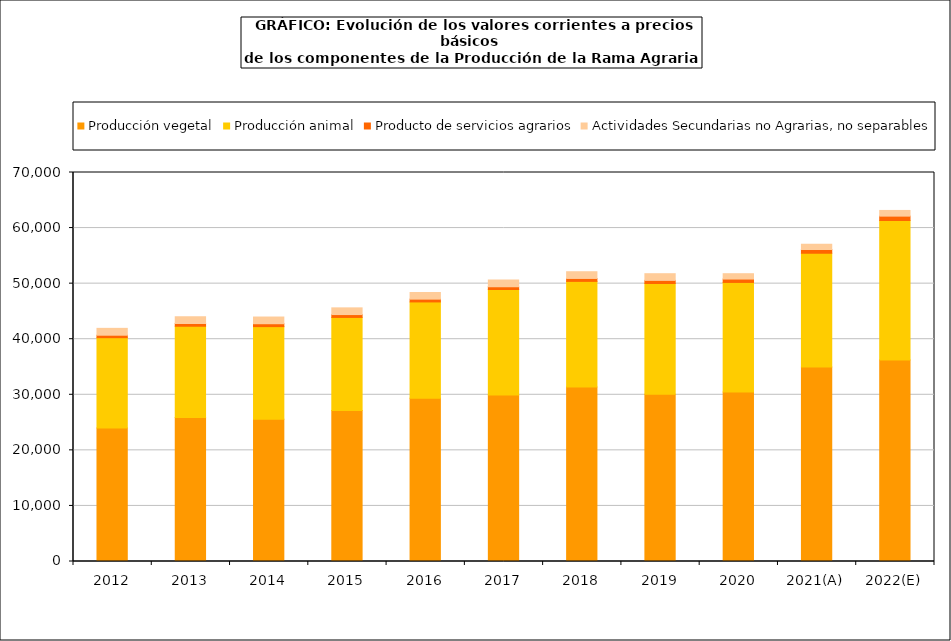
| Category | Producción vegetal | Producción animal | Producto de servicios agrarios | Actividades Secundarias no Agrarias, no separables |
|---|---|---|---|---|
| 2012 | 24030.3 | 16245.1 | 442.5 | 1236.6 |
| 2013 | 25895.9 | 16457.7 | 468.7 | 1242.3 |
| 2014 | 25585 | 16681.5 | 520.2 | 1207.1 |
| 2015 | 27192.2 | 16727.3 | 514.9 | 1207.6 |
| 2016 | 29398.1 | 17310.6 | 503.7 | 1199.2 |
| 2017 | 29981.4 | 18962 | 506.1 | 1191.3 |
| 2018 | 31405.7 | 19000.5 | 528.6 | 1209.7 |
| 2019 | 30108.3 | 19919.6 | 558 | 1203.1 |
| 2020 | 30484.7 | 19732.3 | 609.9 | 960.3 |
| 2021(A) | 34999.8 | 20478.6 | 680.6 | 943.3 |
| 2022(E) | 36276.1 | 25089.9 | 784 | 1021.9 |